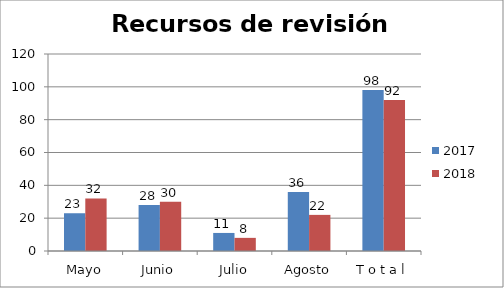
| Category | 2017 | 2018 |
|---|---|---|
| Mayo | 23 | 32 |
| Junio | 28 | 30 |
| Julio | 11 | 8 |
| Agosto | 36 | 22 |
| T o t a l | 98 | 92 |